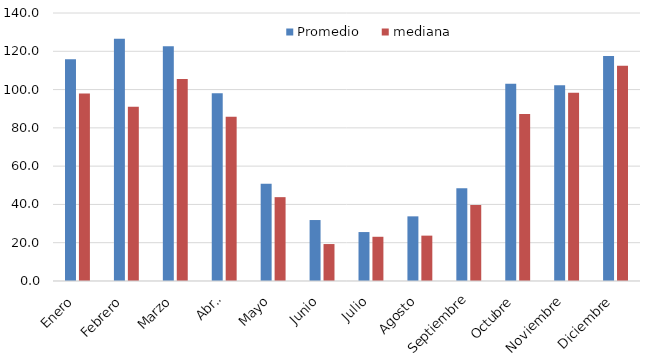
| Category | Promedio | mediana |
|---|---|---|
| Enero | 115.784 | 97.9 |
| Febrero | 126.613 | 91 |
| Marzo | 122.68 | 105.5 |
| Abril | 98.042 | 85.8 |
| Mayo | 50.822 | 43.8 |
| Junio | 31.847 | 19.3 |
| Julio | 25.567 | 23.1 |
| Agosto | 33.774 | 23.7 |
| Septiembre | 48.44 | 39.7 |
| Octubre | 103.08 | 87.2 |
| Noviembre | 102.231 | 98.3 |
| Diciembre | 117.569 | 112.4 |